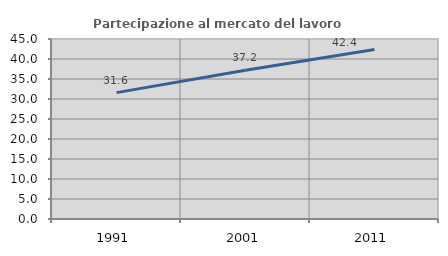
| Category | Partecipazione al mercato del lavoro  femminile |
|---|---|
| 1991.0 | 31.599 |
| 2001.0 | 37.193 |
| 2011.0 | 42.363 |